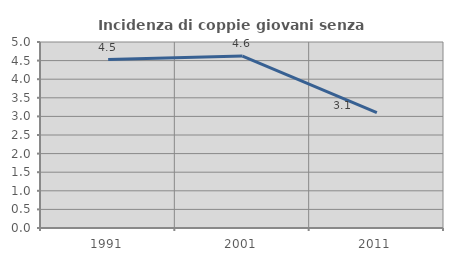
| Category | Incidenza di coppie giovani senza figli |
|---|---|
| 1991.0 | 4.528 |
| 2001.0 | 4.621 |
| 2011.0 | 3.102 |